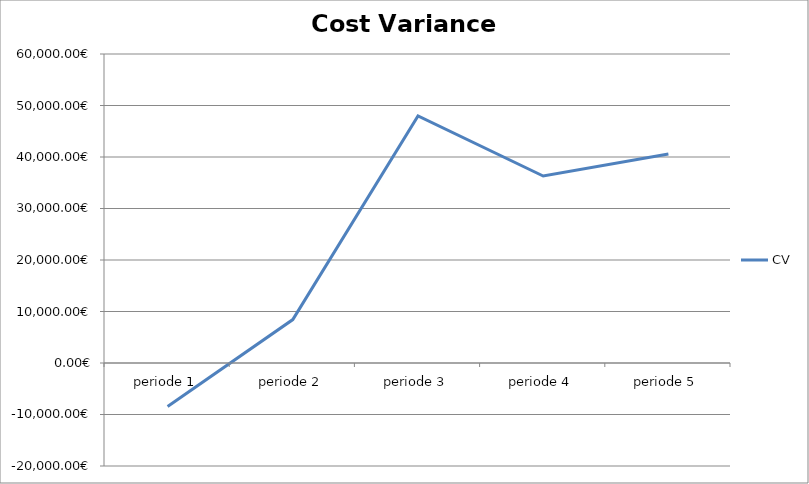
| Category | CV |
|---|---|
| periode 1 | -8457.785 |
| periode 2 | 8427.394 |
| periode 3 | 47982.206 |
| periode 4 | 36311.818 |
| periode 5 | 40599.428 |